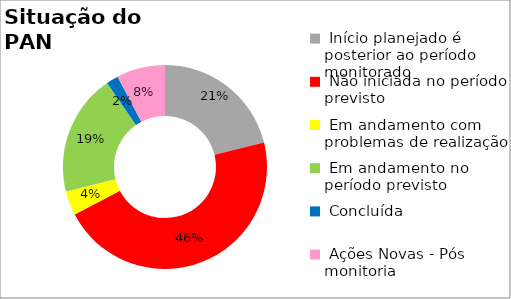
| Category | Series 0 |
|---|---|
|  Início planejado é posterior ao período monitorado | 0.212 |
|  Não iniciada no período previsto | 0.462 |
|  Em andamento com problemas de realização | 0.038 |
|  Em andamento no período previsto  | 0.192 |
|  Concluída | 0.019 |
|  Ações Novas - Pós monitoria | 0.077 |